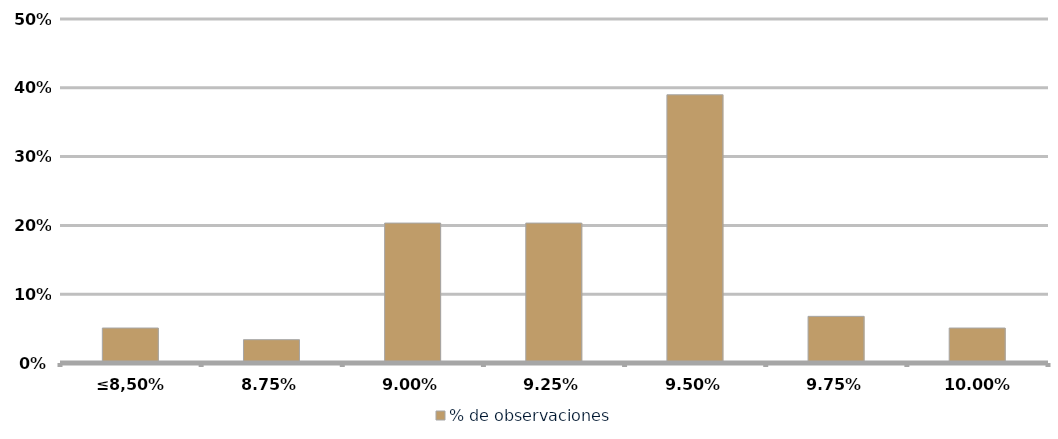
| Category | % de observaciones  |
|---|---|
| ≤8,50% | 0.051 |
| 8,75% | 0.034 |
| 9,00% | 0.203 |
| 9,25% | 0.203 |
| 9,50% | 0.39 |
| 9,75% | 0.068 |
| 10,00% | 0.051 |